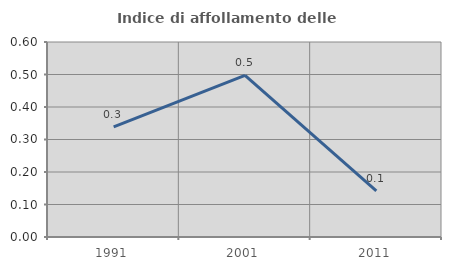
| Category | Indice di affollamento delle abitazioni  |
|---|---|
| 1991.0 | 0.339 |
| 2001.0 | 0.498 |
| 2011.0 | 0.142 |